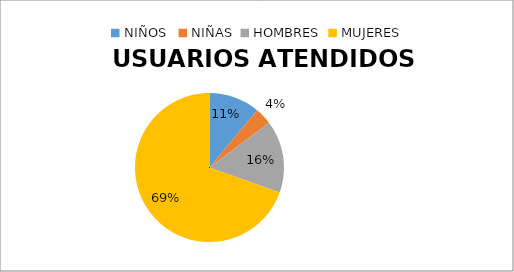
| Category | USUARIOS ATENDIDOS  PORCENTAJE | USUARIOS ATENDIDOS  CANTIDAD |
|---|---|---|
| NIÑOS  | 11.037 | 33 |
| NIÑAS | 3.679 | 11 |
| HOMBRES | 15.719 | 47 |
| MUJERES | 69.565 | 208 |